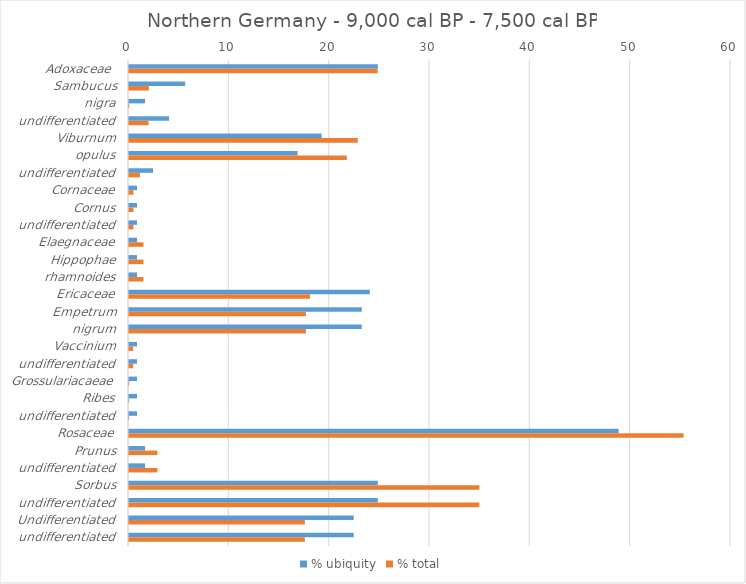
| Category | % ubiquity | % total |
|---|---|---|
| Adoxaceae  | 24.8 | 24.782 |
| Sambucus | 5.6 | 1.979 |
| nigra | 1.6 | 0.033 |
| undifferentiated | 4 | 1.947 |
| Viburnum | 19.2 | 22.803 |
| opulus | 16.8 | 21.71 |
| undifferentiated | 2.4 | 1.093 |
| Cornaceae | 0.8 | 0.441 |
| Cornus | 0.8 | 0.441 |
| undifferentiated | 0.8 | 0.441 |
| Elaegnaceae | 0.8 | 1.439 |
| Hippophae | 0.8 | 1.439 |
| rhamnoides | 0.8 | 1.439 |
| Ericaceae | 24 | 18.048 |
| Empetrum | 23.2 | 17.63 |
| nigrum | 23.2 | 17.63 |
| Vaccinium | 0.8 | 0.418 |
| undifferentiated | 0.8 | 0.418 |
| Grossulariacaeae | 0.8 | 0.015 |
| Ribes | 0.8 | 0.015 |
| undifferentiated | 0.8 | 0.015 |
| Rosaceae | 48.8 | 55.274 |
| Prunus | 1.6 | 2.832 |
| undifferentiated | 1.6 | 2.832 |
| Sorbus | 24.8 | 34.917 |
| undifferentiated | 24.8 | 34.917 |
| Undifferentiated | 22.4 | 17.525 |
| undifferentiated | 22.4 | 17.525 |